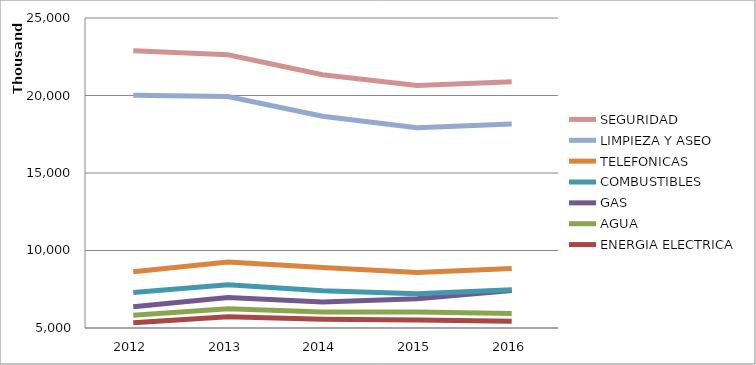
| Category | ENERGIA ELECTRICA | AGUA | GAS | COMBUSTIBLES | TELEFONICAS | LIMPIEZA Y ASEO | SEGURIDAD |
|---|---|---|---|---|---|---|---|
| 2012.0 | 5344093.24 | 481542.49 | 550637.36 | 916994.02 | 1341481.37 | 11376013.49 | 2874879.15 |
| 2013.0 | 5717816.03 | 521464.47 | 727129.1 | 818822.05 | 1477255.81 | 10670231.78 | 2692955.56 |
| 2014.0 | 5558877.72 | 469020.08 | 653634.1 | 715218.99 | 1499929.02 | 9763423.91 | 2676149.46 |
| 2015.0 | 5516737.94 | 512523.83 | 855317.59 | 319635.26 | 1375591.82 | 9336197.81 | 2731804.78 |
| 2016.0 | 5432434.75 | 509733.78 | 1481455.23 | 50923.19 | 1371835.12 | 9313981.68 | 2728487.81 |